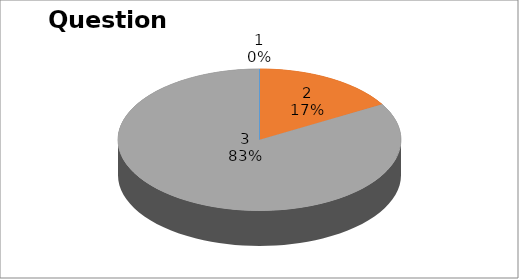
| Category | Series 0 |
|---|---|
| 0 | 0 |
| 1 | 9 |
| 2 | 45 |